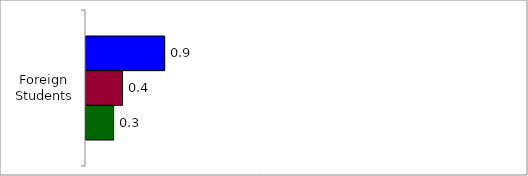
| Category | 50 States and D.C. | SREB States | State |
|---|---|---|---|
| Foreign Students | 0.909 | 0.422 | 0.319 |